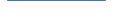
| Category | Series 0 |
|---|---|
| 0 | 7 |
| 1 | 11 |
| 2 | 39 |
| 3 | 4 |
| 4 | 6 |
| 5 | 12 |
| 6 | 4 |
| 7 | 5 |
| 8 | 9 |